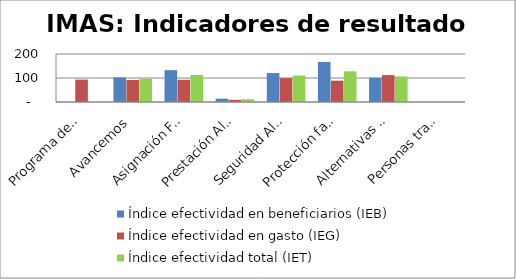
| Category | Índice efectividad en beneficiarios (IEB) | Índice efectividad en gasto (IEG)  | Índice efectividad total (IET) |
|---|---|---|---|
| Programa de Promoción y Protección Social | 0 | 93.333 | 0 |
| Avancemos | 102.542 | 91.892 | 97.217 |
| Asignación Familiar | 132.686 | 92.578 | 112.632 |
| Prestación Alimentaria | 13.908 | 9.07 | 11.489 |
| Seguridad Alimentaria | 120.61 | 99.625 | 110.117 |
| Protección familiar | 166.806 | 88.883 | 127.845 |
| Alternativas de Cuido | 100.805 | 111.981 | 106.393 |
| Personas trabajadores menores de edad | 0 | 0 | 0 |